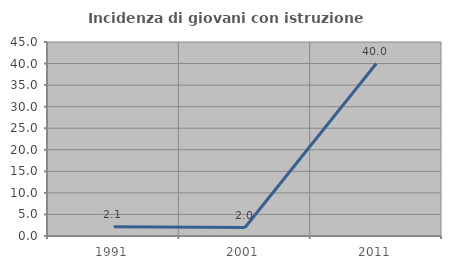
| Category | Incidenza di giovani con istruzione universitaria |
|---|---|
| 1991.0 | 2.128 |
| 2001.0 | 1.961 |
| 2011.0 | 40 |